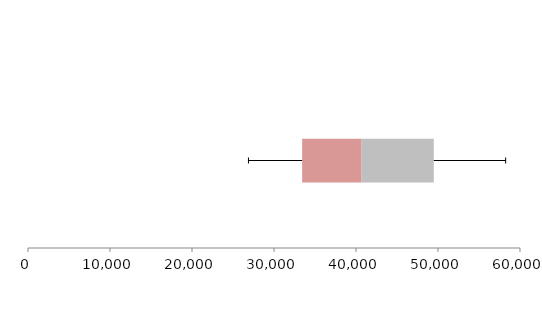
| Category | Series 1 | Series 2 | Series 3 |
|---|---|---|---|
| 0 | 33432.163 | 7254.28 | 8799.361 |